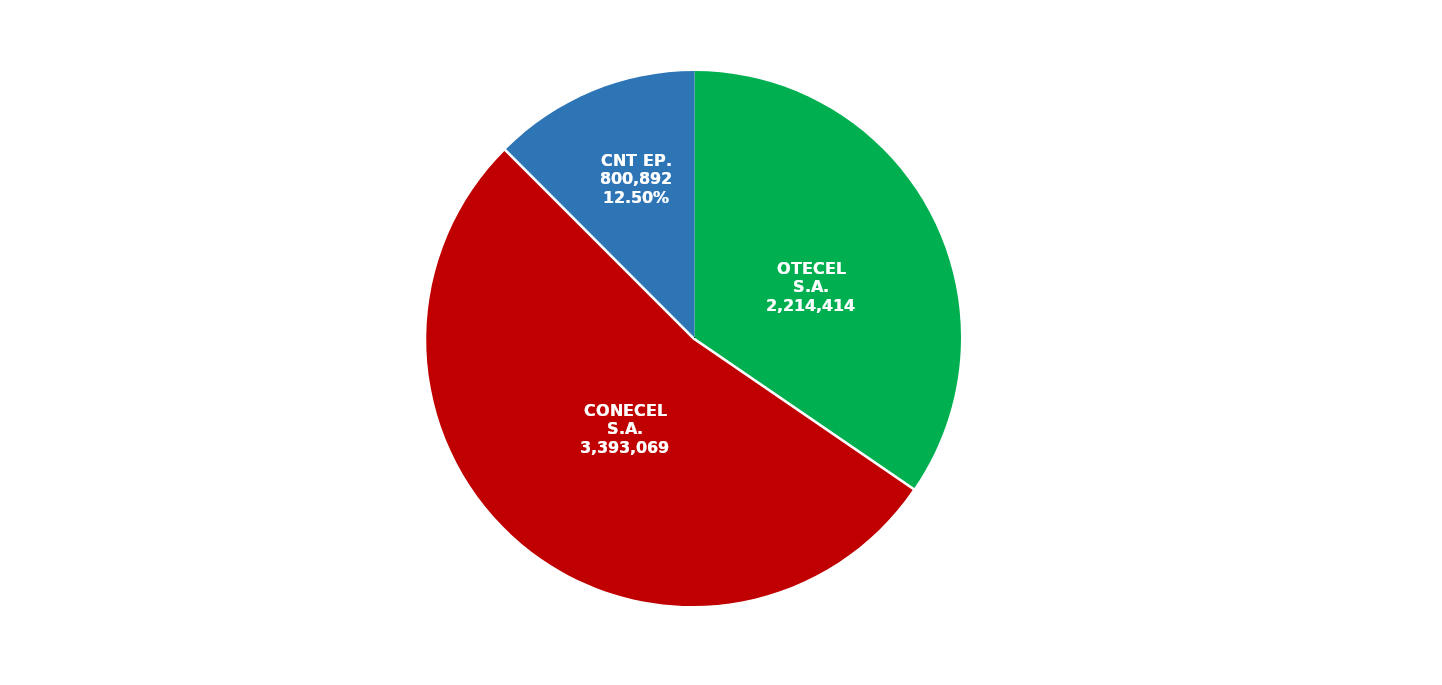
| Category | Series 0 |
|---|---|
| OTECEL S.A. | 2214414 |
| CONECEL S.A. | 3393069 |
| CNT EP. | 800892 |